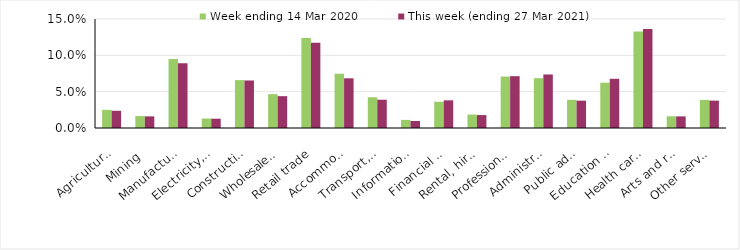
| Category | Week ending 14 Mar 2020 | This week (ending 27 Mar 2021) |
|---|---|---|
| Agriculture, forestry and fishing | 0.025 | 0.024 |
| Mining | 0.016 | 0.016 |
| Manufacturing | 0.095 | 0.089 |
| Electricity, gas, water and waste services | 0.013 | 0.013 |
| Construction | 0.066 | 0.065 |
| Wholesale trade | 0.047 | 0.044 |
| Retail trade | 0.124 | 0.117 |
| Accommodation and food services | 0.075 | 0.068 |
| Transport, postal and warehousing | 0.042 | 0.039 |
| Information media and telecommunications | 0.011 | 0.01 |
| Financial and insurance services | 0.036 | 0.038 |
| Rental, hiring and real estate services | 0.018 | 0.018 |
| Professional, scientific and technical services | 0.071 | 0.071 |
| Administrative and support services | 0.068 | 0.074 |
| Public administration and safety | 0.039 | 0.038 |
| Education and training | 0.062 | 0.068 |
| Health care and social assistance | 0.133 | 0.136 |
| Arts and recreation services | 0.016 | 0.016 |
| Other services | 0.039 | 0.038 |